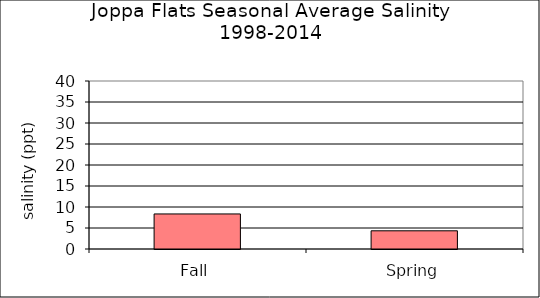
| Category | Grand Total |
|---|---|
| Fall | 8.345 |
| Spring | 4.334 |